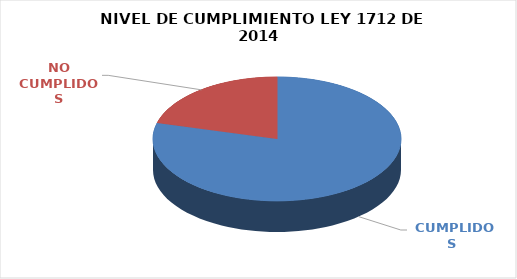
| Category | Series 0 |
|---|---|
|  CUMPLIDOS | 91 |
| NO CUMPLIDOS | 24 |